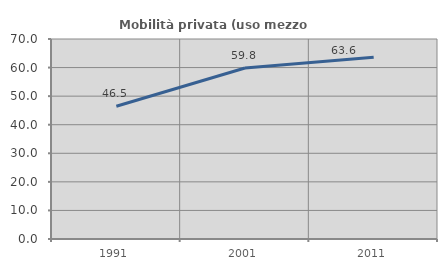
| Category | Mobilità privata (uso mezzo privato) |
|---|---|
| 1991.0 | 46.482 |
| 2001.0 | 59.831 |
| 2011.0 | 63.636 |